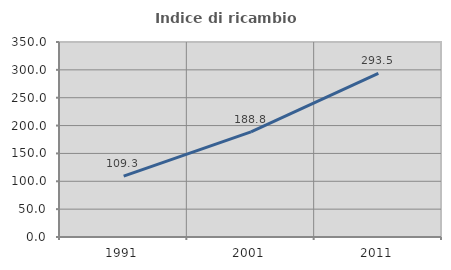
| Category | Indice di ricambio occupazionale  |
|---|---|
| 1991.0 | 109.334 |
| 2001.0 | 188.765 |
| 2011.0 | 293.497 |